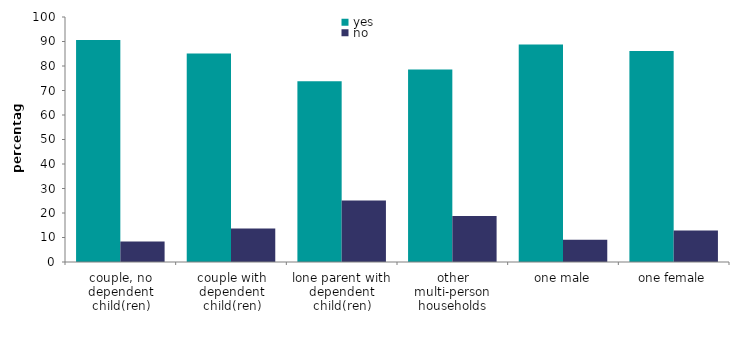
| Category | yes | no |
|---|---|---|
| couple, no dependent child(ren) | 90.652 | 8.413 |
| couple with dependent child(ren) | 85.122 | 13.63 |
| lone parent with dependent child(ren) | 73.729 | 25.109 |
| other multi-person households | 78.597 | 18.763 |
| one male | 88.728 | 9.125 |
| one female | 86.138 | 12.821 |